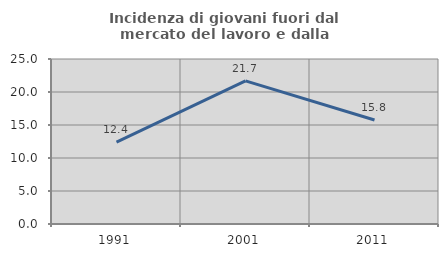
| Category | Incidenza di giovani fuori dal mercato del lavoro e dalla formazione  |
|---|---|
| 1991.0 | 12.421 |
| 2001.0 | 21.691 |
| 2011.0 | 15.755 |